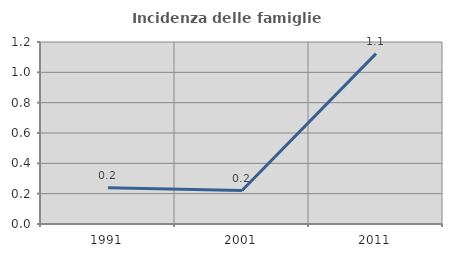
| Category | Incidenza delle famiglie numerose |
|---|---|
| 1991.0 | 0.239 |
| 2001.0 | 0.221 |
| 2011.0 | 1.124 |